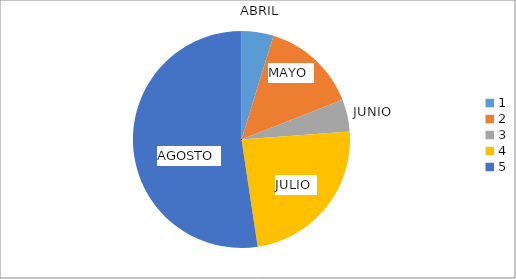
| Category | Series 0 |
|---|---|
| 0 | 1 |
| 1 | 3 |
| 2 | 1 |
| 3 | 5 |
| 4 | 11 |